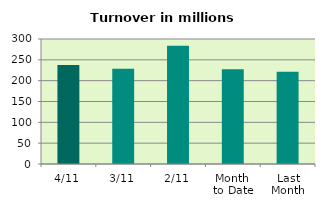
| Category | Series 0 |
|---|---|
| 4/11 | 237.366 |
| 3/11 | 228.302 |
| 2/11 | 283.962 |
| Month 
to Date | 227.141 |
| Last
Month | 221.516 |